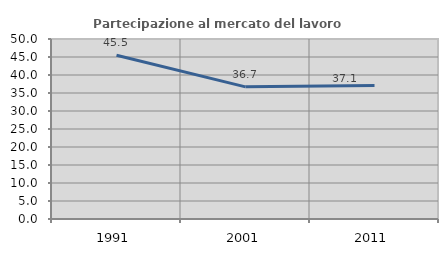
| Category | Partecipazione al mercato del lavoro  femminile |
|---|---|
| 1991.0 | 45.47 |
| 2001.0 | 36.711 |
| 2011.0 | 37.1 |